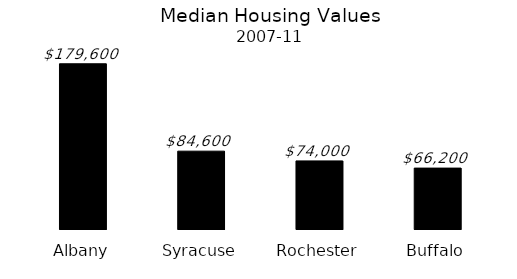
| Category | Median Value |
|---|---|
| Albany | 179600 |
| Syracuse | 84600 |
| Rochester | 74000 |
| Buffalo | 66200 |